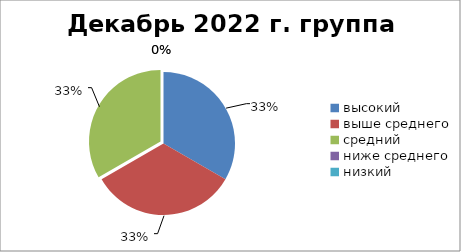
| Category | Декабрь 2022 г. | Series 1 |
|---|---|---|
| высокий | 1 |  |
| выше среднего | 1 |  |
| средний | 1 |  |
| ниже среднего | 0 |  |
| низкий | 0 |  |